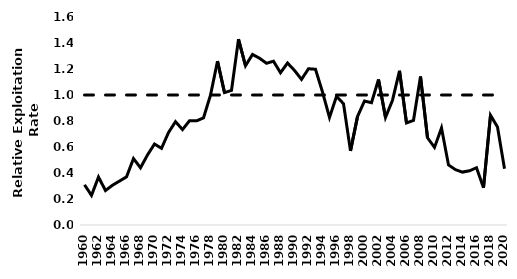
| Category | (1-SPR)/(1-SPR50%) | Fmsy |
|---|---|---|
| 1960.0 | 0.309 | 1 |
| 1961.0 | 0.228 | 1 |
| 1962.0 | 0.369 | 1 |
| 1963.0 | 0.265 | 1 |
| 1964.0 | 0.306 | 1 |
| 1965.0 | 0.338 | 1 |
| 1966.0 | 0.37 | 1 |
| 1967.0 | 0.511 | 1 |
| 1968.0 | 0.44 | 1 |
| 1969.0 | 0.539 | 1 |
| 1970.0 | 0.623 | 1 |
| 1971.0 | 0.59 | 1 |
| 1972.0 | 0.711 | 1 |
| 1973.0 | 0.795 | 1 |
| 1974.0 | 0.734 | 1 |
| 1975.0 | 0.802 | 1 |
| 1976.0 | 0.801 | 1 |
| 1977.0 | 0.824 | 1 |
| 1978.0 | 0.999 | 1 |
| 1979.0 | 1.26 | 1 |
| 1980.0 | 1.018 | 1 |
| 1981.0 | 1.036 | 1 |
| 1982.0 | 1.429 | 1 |
| 1983.0 | 1.225 | 1 |
| 1984.0 | 1.312 | 1 |
| 1985.0 | 1.283 | 1 |
| 1986.0 | 1.244 | 1 |
| 1987.0 | 1.26 | 1 |
| 1988.0 | 1.171 | 1 |
| 1989.0 | 1.246 | 1 |
| 1990.0 | 1.189 | 1 |
| 1991.0 | 1.12 | 1 |
| 1992.0 | 1.202 | 1 |
| 1993.0 | 1.198 | 1 |
| 1994.0 | 1.023 | 1 |
| 1995.0 | 0.827 | 1 |
| 1996.0 | 0.99 | 1 |
| 1997.0 | 0.933 | 1 |
| 1998.0 | 0.57 | 1 |
| 1999.0 | 0.834 | 1 |
| 2000.0 | 0.954 | 1 |
| 2001.0 | 0.941 | 1 |
| 2002.0 | 1.119 | 1 |
| 2003.0 | 0.828 | 1 |
| 2004.0 | 0.96 | 1 |
| 2005.0 | 1.186 | 1 |
| 2006.0 | 0.785 | 1 |
| 2007.0 | 0.805 | 1 |
| 2008.0 | 1.142 | 1 |
| 2009.0 | 0.671 | 1 |
| 2010.0 | 0.597 | 1 |
| 2011.0 | 0.747 | 1 |
| 2012.0 | 0.462 | 1 |
| 2013.0 | 0.425 | 1 |
| 2014.0 | 0.407 | 1 |
| 2015.0 | 0.417 | 1 |
| 2016.0 | 0.441 | 1 |
| 2017.0 | 0.287 | 1 |
| 2018.0 | 0.844 | 1 |
| 2019.0 | 0.753 | 1 |
| 2020.0 | 0.433 | 1 |